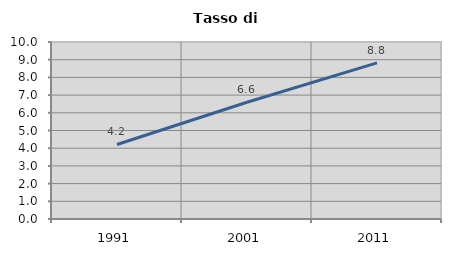
| Category | Tasso di disoccupazione   |
|---|---|
| 1991.0 | 4.211 |
| 2001.0 | 6.593 |
| 2011.0 | 8.824 |